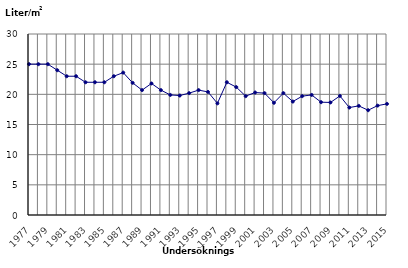
| Category | Oljeförbrukning |
|---|---|
| 1977 | 25 |
| 1978 | 25 |
| 1979 | 25 |
| 1980 | 24 |
| 1981 | 23 |
| 1982 | 23 |
| 1983 | 22 |
| 1984 | 22 |
| 1985 | 22 |
| 1986 | 23 |
| 1987 | 23.6 |
| 1988 | 21.9 |
| 1989 | 20.7 |
| 1990 | 21.8 |
| 1991 | 20.7 |
| 1992 | 19.9 |
| 1993 | 19.8 |
| 1994 | 20.2 |
| 1995 | 20.7 |
| 1996 | 20.4 |
| 1997 | 18.5 |
| 1998 | 22 |
| 1999 | 21.2 |
| 2000 | 19.7 |
| 2001 | 20.3 |
| 2002 | 20.2 |
| 2003 | 18.6 |
| 2004 | 20.2 |
| 2005 | 18.8 |
| 2006 | 19.7 |
| 2007 | 19.9 |
| 2008 | 18.7 |
| 2009 | 18.653 |
| 2010 | 19.736 |
| 2011 | 17.812 |
| 2012 | 18.085 |
| 2013 | 17.369 |
| 2014 | 18.127 |
| 2015 | 18.42 |